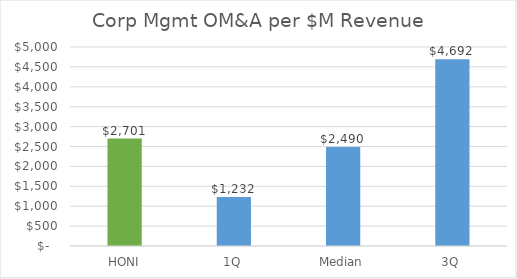
| Category | Corp Mgmt OM&A per $M Revenue |
|---|---|
| HONI | 2700.735 |
| 1Q | 1231.56 |
| Median | 2490.161 |
| 3Q | 4692.346 |